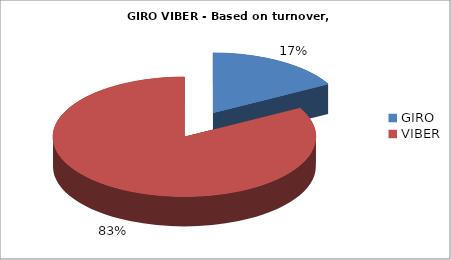
| Category | Series 0 |
|---|---|
| GIRO | 0.17 |
| VIBER | 0.83 |